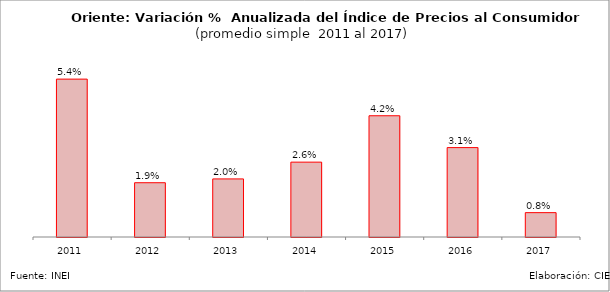
| Category | Series 0 |
|---|---|
| 2011.0 | 0.054 |
| 2012.0 | 0.019 |
| 2013.0 | 0.02 |
| 2014.0 | 0.026 |
| 2015.0 | 0.042 |
| 2016.0 | 0.031 |
| 2017.0 | 0.008 |